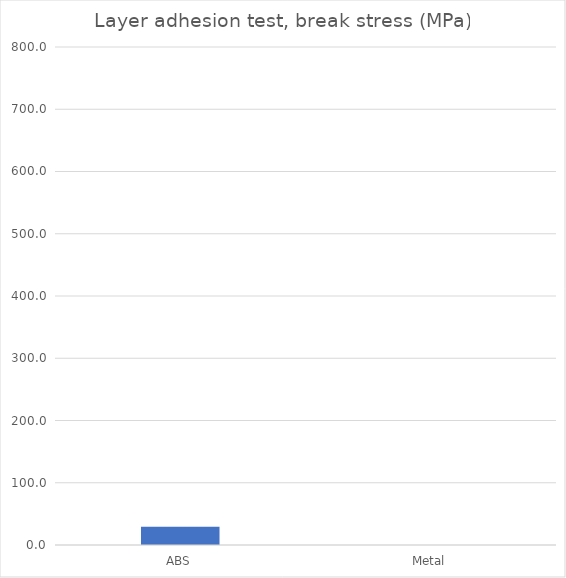
| Category | Stress [MPa] |
|---|---|
| ABS | 29.369 |
| Metal | 0 |